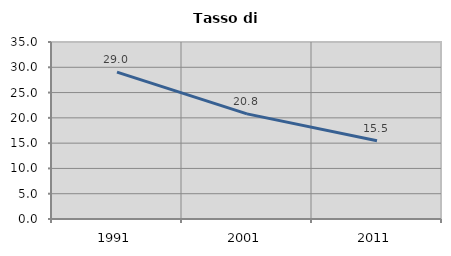
| Category | Tasso di disoccupazione   |
|---|---|
| 1991.0 | 29.046 |
| 2001.0 | 20.784 |
| 2011.0 | 15.483 |